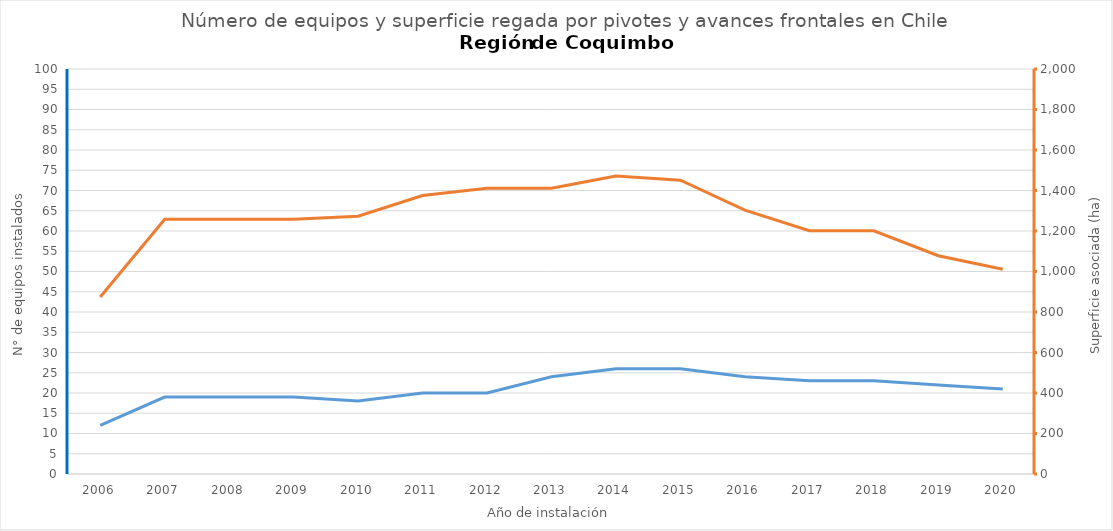
| Category | N° |
|---|---|
| 2006.0 | 12 |
| 2007.0 | 19 |
| 2008.0 | 19 |
| 2009.0 | 19 |
| 2010.0 | 18 |
| 2011.0 | 20 |
| 2012.0 | 20 |
| 2013.0 | 24 |
| 2014.0 | 26 |
| 2015.0 | 26 |
| 2016.0 | 24 |
| 2017.0 | 23 |
| 2018.0 | 23 |
| 2019.0 | 22 |
| 2020.0 | 21 |